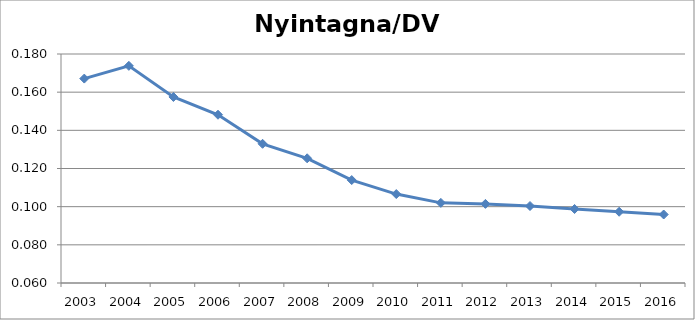
| Category | Nyintagna/DV ut |
|---|---|
| 2003.0 | 0.167 |
| 2004.0 | 0.174 |
| 2005.0 | 0.157 |
| 2006.0 | 0.148 |
| 2007.0 | 0.133 |
| 2008.0 | 0.125 |
| 2009.0 | 0.114 |
| 2010.0 | 0.107 |
| 2011.0 | 0.102 |
| 2012.0 | 0.101 |
| 2013.0 | 0.1 |
| 2014.0 | 0.099 |
| 2015.0 | 0.097 |
| 2016.0 | 0.096 |